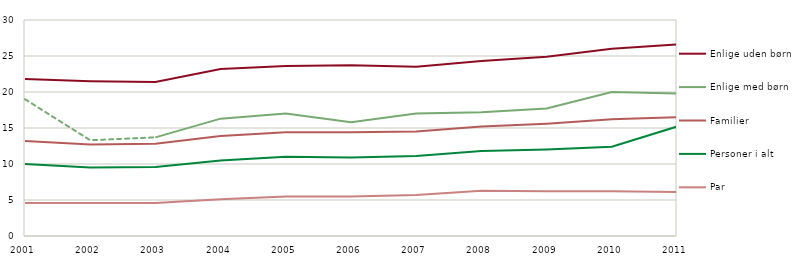
| Category | Enlige uden børn | Enlige med børn | Familier  | Personer i alt  | Par  |
|---|---|---|---|---|---|
| 2001.0 | 21.8 | 19 | 13.2 | 10 | 4.6 |
| 2002.0 | 21.5 | 13.3 | 12.7 | 9.5 | 4.6 |
| 2003.0 | 21.4 | 13.7 | 12.8 | 9.6 | 4.6 |
| 2004.0 | 23.2 | 16.3 | 13.9 | 10.5 | 5.1 |
| 2005.0 | 23.6 | 17 | 14.4 | 11 | 5.5 |
| 2006.0 | 23.7 | 15.8 | 14.4 | 10.9 | 5.5 |
| 2007.0 | 23.5 | 17 | 14.5 | 11.1 | 5.7 |
| 2008.0 | 24.3 | 17.2 | 15.2 | 11.8 | 6.3 |
| 2009.0 | 24.9 | 17.7 | 15.6 | 12 | 6.2 |
| 2010.0 | 26 | 20 | 16.2 | 12.4 | 6.2 |
| 2011.0 | 26.6 | 19.8 | 16.5 | 15.2 | 6.1 |